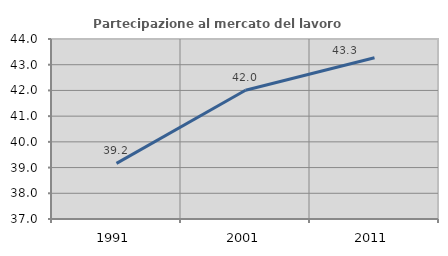
| Category | Partecipazione al mercato del lavoro  femminile |
|---|---|
| 1991.0 | 39.165 |
| 2001.0 | 42.005 |
| 2011.0 | 43.273 |